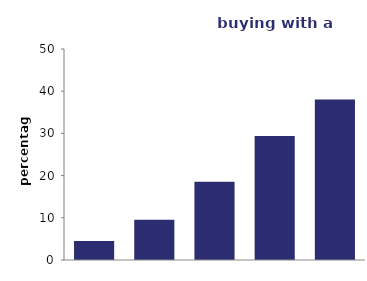
| Category | buying with a mortgage |
|---|---|
| 1st    quintile (lowest incomes) | 4.482 |
| 2nd    quintile | 9.513 |
| 3rd    quintile | 18.547 |
| 4th    quintile | 29.398 |
| 5th     quintile (highest incomes) | 38.06 |